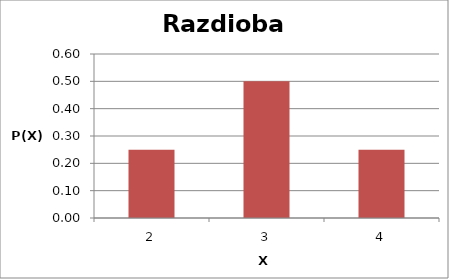
| Category | Series 0 |
|---|---|
| 2.0 | 0.25 |
| 3.0 | 0.5 |
| 4.0 | 0.25 |